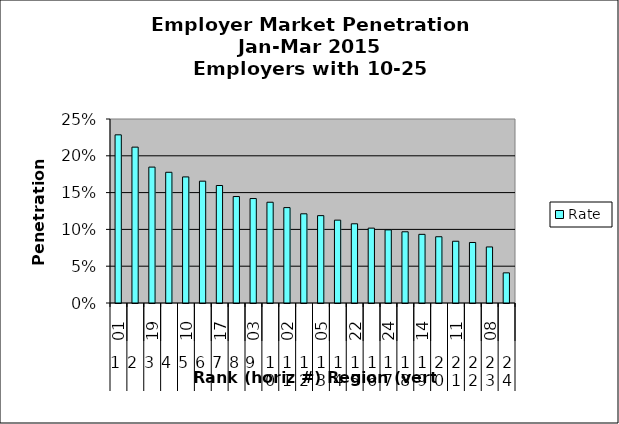
| Category | Rate |
|---|---|
| 0 | 0.228 |
| 1 | 0.212 |
| 2 | 0.185 |
| 3 | 0.178 |
| 4 | 0.171 |
| 5 | 0.166 |
| 6 | 0.16 |
| 7 | 0.145 |
| 8 | 0.142 |
| 9 | 0.137 |
| 10 | 0.13 |
| 11 | 0.121 |
| 12 | 0.119 |
| 13 | 0.113 |
| 14 | 0.108 |
| 15 | 0.102 |
| 16 | 0.099 |
| 17 | 0.097 |
| 18 | 0.093 |
| 19 | 0.09 |
| 20 | 0.084 |
| 21 | 0.082 |
| 22 | 0.076 |
| 23 | 0.041 |